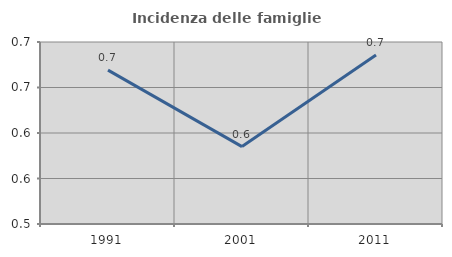
| Category | Incidenza delle famiglie numerose |
|---|---|
| 1991.0 | 0.669 |
| 2001.0 | 0.585 |
| 2011.0 | 0.686 |